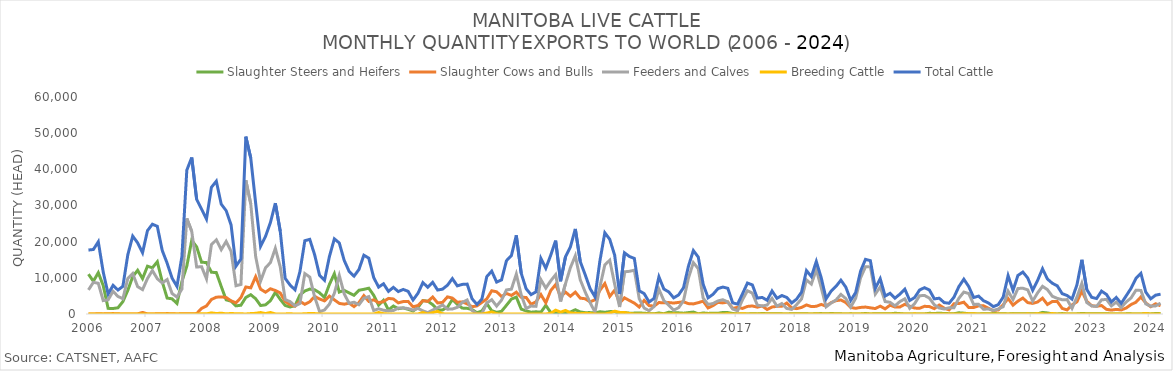
| Category | Slaughter Steers and Heifers | Slaughter Cows and Bulls | Feeders and Calves | Breeding Cattle | Total Cattle |
|---|---|---|---|---|---|
| 2006-01-01 | 11012 | 12 | 6661 | 0 | 17685 |
| 2006-02-01 | 9053 | 22 | 8762 | 0 | 17837 |
| 2006-03-01 | 11426 | 50 | 8493 | 0 | 19969 |
| 2006-04-01 | 7870 | 31 | 3706 | 0 | 11607 |
| 2006-05-01 | 1559 | 66 | 3914 | 0 | 5539 |
| 2006-06-01 | 1517 | 116 | 6281 | 0 | 7914 |
| 2006-07-01 | 1715 | 53 | 4860 | 0 | 6628 |
| 2006-08-01 | 3430 | 0 | 4226 | 0 | 7656 |
| 2006-09-01 | 6531 | 30 | 9804 | 0 | 16365 |
| 2006-10-01 | 10330 | 28 | 11172 | 0 | 21530 |
| 2006-11-01 | 12086 | 34 | 7560 | 0 | 19680 |
| 2006-12-01 | 9790 | 432 | 6739 | 0 | 16961 |
| 2007-01-01 | 13221 | 20 | 9806 | 0 | 23047 |
| 2007-02-01 | 12777 | 18 | 12028 | 0 | 24823 |
| 2007-03-01 | 14447 | 47 | 9751 | 0 | 24245 |
| 2007-04-01 | 8936 | 51 | 8583 | 0 | 17570 |
| 2007-05-01 | 4407 | 118 | 9529 | 0 | 14054 |
| 2007-06-01 | 4197 | 67 | 5667 | 0 | 9931 |
| 2007-07-01 | 2924 | 18 | 4689 | 0 | 7631 |
| 2007-08-01 | 8957 | 56 | 6884 | 0 | 15897 |
| 2007-09-01 | 13246 | 90 | 26436 | 0 | 39772 |
| 2007-10-01 | 20373 | 35 | 22855 | 0 | 43263 |
| 2007-11-01 | 18570 | 124 | 12991 | 0 | 31685 |
| 2007-12-01 | 14310 | 1544 | 13086 | 54 | 28994 |
| 2008-01-01 | 14234 | 2227 | 9728 | 36 | 26225 |
| 2008-02-01 | 11547 | 4011 | 19157 | 307 | 35022 |
| 2008-03-01 | 11453 | 4646 | 20512 | 132 | 36743 |
| 2008-04-01 | 7614 | 4728 | 17791 | 223 | 30356 |
| 2008-05-01 | 3915 | 4556 | 20068 | 41 | 28580 |
| 2008-06-01 | 3547 | 3638 | 17312 | 136 | 24633 |
| 2008-07-01 | 2246 | 3086 | 7814 | 72 | 13218 |
| 2008-08-01 | 2429 | 4526 | 8165 | 61 | 15181 |
| 2008-09-01 | 4574 | 7470 | 36975 | 11 | 49030 |
| 2008-10-01 | 5333 | 7226 | 30465 | 115 | 43139 |
| 2008-11-01 | 4226 | 10312 | 15890 | 191 | 30619 |
| 2008-12-01 | 2339 | 6867 | 9094 | 402 | 18702 |
| 2009-01-01 | 2532 | 6032 | 12756 | 126 | 21446 |
| 2009-02-01 | 3675 | 6977 | 14219 | 412 | 25283 |
| 2009-03-01 | 5982 | 6492 | 18150 | 25 | 30649 |
| 2009-04-01 | 4040 | 5811 | 13024 | 1 | 22876 |
| 2009-05-01 | 2357 | 3473 | 3988 | 28 | 9846 |
| 2009-06-01 | 1944 | 2571 | 3423 | 65 | 8003 |
| 2009-07-01 | 2289 | 2147 | 2252 | 3 | 6691 |
| 2009-08-01 | 5274 | 3492 | 2912 | 8 | 11686 |
| 2009-09-01 | 6360 | 2677 | 11172 | 56 | 20265 |
| 2009-10-01 | 6889 | 3390 | 10212 | 152 | 20643 |
| 2009-11-01 | 6687 | 4861 | 4687 | 114 | 16349 |
| 2009-12-01 | 5860 | 4154 | 638 | 3 | 10655 |
| 2010-01-01 | 4568 | 3629 | 1113 | 21 | 9331 |
| 2010-02-01 | 8199 | 4944 | 2727 | 33 | 15903 |
| 2010-03-01 | 11135 | 3911 | 5731 | 0 | 20777 |
| 2010-04-01 | 6059 | 2935 | 10659 | 4 | 19657 |
| 2010-05-01 | 6524 | 2712 | 5601 | 2 | 14839 |
| 2010-06-01 | 5849 | 3000 | 2945 | 2 | 11796 |
| 2010-07-01 | 5162 | 2052 | 3253 | 0 | 10467 |
| 2010-08-01 | 6571 | 3162 | 2563 | 3 | 12299 |
| 2010-09-01 | 6819 | 5087 | 4349 | 0 | 16255 |
| 2010-10-01 | 7134 | 3495 | 4815 | 3 | 15447 |
| 2010-11-01 | 5185 | 3931 | 977 | 2 | 10095 |
| 2010-12-01 | 2458 | 3131 | 1441 | 408 | 7438 |
| 2011-01-01 | 3788 | 3436 | 1039 | 91 | 8354 |
| 2011-02-01 | 1087 | 4309 | 863 | 0 | 6259 |
| 2011-03-01 | 2207 | 4162 | 963 | 31 | 7363 |
| 2011-04-01 | 1463 | 3082 | 1638 | 27 | 6210 |
| 2011-05-01 | 1675 | 3440 | 1671 | 2 | 6788 |
| 2011-06-01 | 1286 | 3487 | 1506 | 0 | 6279 |
| 2011-07-01 | 827 | 1977 | 1074 | 1 | 3879 |
| 2011-08-01 | 1805 | 2357 | 1549 | 7 | 5718 |
| 2011-09-01 | 3719 | 3683 | 878 | 394 | 8674 |
| 2011-10-01 | 3541 | 3488 | 372 | 0 | 7401 |
| 2011-11-01 | 2583 | 4689 | 1099 | 377 | 8748 |
| 2011-12-01 | 1126 | 3054 | 1718 | 731 | 6629 |
| 2012-01-01 | 1105 | 3199 | 2515 | 53 | 6872 |
| 2012-02-01 | 1887 | 4733 | 1337 | 0 | 7957 |
| 2012-03-01 | 3999 | 4399 | 1380 | 8 | 9786 |
| 2012-04-01 | 2667 | 3253 | 1832 | 24 | 7776 |
| 2012-05-01 | 1633 | 3356 | 3186 | 8 | 8183 |
| 2012-06-01 | 1575 | 2815 | 3874 | 0 | 8264 |
| 2012-07-01 | 1233 | 2010 | 963 | 3 | 4209 |
| 2012-08-01 | 332 | 2241 | 68 | 0 | 2641 |
| 2012-09-01 | 835 | 3213 | 70 | 0 | 4118 |
| 2012-10-01 | 2862 | 4173 | 3050 | 258 | 10343 |
| 2012-11-01 | 902 | 6423 | 3949 | 573 | 11847 |
| 2012-12-01 | 449 | 6138 | 2193 | 45 | 8825 |
| 2013-01-01 | 755 | 4837 | 3839 | 3 | 9434 |
| 2013-02-01 | 2408 | 5684 | 6652 | 0 | 14744 |
| 2013-03-01 | 4128 | 5141 | 6865 | 15 | 16149 |
| 2013-04-01 | 4674 | 6035 | 11030 | 10 | 21749 |
| 2013-05-01 | 1346 | 4640 | 5269 | 0 | 11255 |
| 2013-06-01 | 872 | 4575 | 1515 | 6 | 6968 |
| 2013-07-01 | 494 | 2669 | 2195 | 0 | 5358 |
| 2013-08-01 | 616 | 3390 | 2116 | 0 | 6122 |
| 2013-09-01 | 494 | 5371 | 9494 | 7 | 15366 |
| 2013-10-01 | 2406 | 3096 | 7168 | 0 | 12670 |
| 2013-11-01 | 394 | 6485 | 9180 | 193 | 16252 |
| 2013-12-01 | 235 | 8134 | 10874 | 1062 | 20305 |
| 2014-01-01 | 287 | 4810 | 3458 | 499 | 9054 |
| 2014-02-01 | 383 | 6054 | 8375 | 987 | 15799 |
| 2014-03-01 | 547 | 4908 | 12812 | 280 | 18547 |
| 2014-04-01 | 1177 | 6046 | 16098 | 199 | 23520 |
| 2014-05-01 | 561 | 4384 | 9468 | 94 | 14507 |
| 2014-06-01 | 375 | 4215 | 6097 | 188 | 10875 |
| 2014-07-01 | 383 | 3357 | 3157 | 132 | 7029 |
| 2014-08-01 | 290 | 3932 | 524 | 5 | 4751 |
| 2014-09-01 | 625 | 6545 | 7516 | 4 | 14690 |
| 2014-10-01 | 472 | 8424 | 13568 | 0 | 22464 |
| 2014-11-01 | 663 | 4859 | 14881 | 240 | 20643 |
| 2014-12-01 | 649 | 6580 | 8251 | 779 | 16259 |
| 2015-01-01 | 100 | 3038 | 1936 | 451 | 5525 |
| 2015-02-01 | 378 | 4466 | 11661 | 418 | 16923 |
| 2015-03-01 | 233 | 3728 | 11804 | 137 | 15902 |
| 2015-04-01 | 243 | 3007 | 12102 | 13 | 15365 |
| 2015-05-01 | 277 | 1929 | 4208 | 1 | 6415 |
| 2015-06-01 | 220 | 3754 | 1646 | 15 | 5635 |
| 2015-07-01 | 92 | 2322 | 897 | 2 | 3313 |
| 2015-08-01 | 42 | 2186 | 2071 | 3 | 4302 |
| 2015-09-01 | 288 | 3162 | 6832 | 0 | 10282 |
| 2015-10-01 | 63 | 3105 | 3726 | 6 | 6900 |
| 2015-11-01 | 495 | 3163 | 2445 | 0 | 6103 |
| 2015-12-01 | 332 | 3030 | 1064 | 41 | 4467 |
| 2016-01-01 | 321 | 3209 | 1739 | 4 | 5273 |
| 2016-02-01 | 226 | 3367 | 3682 | 6 | 7281 |
| 2016-03-01 | 379 | 2869 | 9941 | 7 | 13196 |
| 2016-04-01 | 532 | 2787 | 14207 | 13 | 17539 |
| 2016-05-01 | 58 | 3137 | 12538 | 0 | 15733 |
| 2016-06-01 | 283 | 3555 | 4382 | 9 | 8229 |
| 2016-07-01 | 163 | 1671 | 2646 | 0 | 4480 |
| 2016-08-01 | 209 | 2328 | 2902 | 3 | 5442 |
| 2016-09-01 | 189 | 3217 | 3604 | 5 | 7015 |
| 2016-10-01 | 430 | 3071 | 3947 | 0 | 7448 |
| 2016-11-01 | 394 | 3327 | 3326 | 61 | 7108 |
| 2016-12-01 | 138 | 1562 | 1385 | 0 | 3085 |
| 2017-01-01 | 20 | 1824 | 881 | 0 | 2725 |
| 2017-02-01 | 4 | 1546 | 3961 | 90 | 5601 |
| 2017-03-01 | 13 | 2095 | 6438 | 10 | 8556 |
| 2017-04-01 | 63 | 2222 | 5760 | 1 | 8046 |
| 2017-05-01 | 30 | 1888 | 2472 | 10 | 4400 |
| 2017-06-01 | 140 | 2214 | 2218 | 8 | 4580 |
| 2017-07-01 | 80 | 1243 | 2474 | 0 | 3797 |
| 2017-08-01 | 94 | 1938 | 4320 | 9 | 6361 |
| 2017-09-01 | 70 | 2104 | 2166 | 5 | 4345 |
| 2017-10-01 | 38 | 2161 | 2894 | 12 | 5105 |
| 2017-11-01 | 0 | 3036 | 1539 | 0 | 4575 |
| 2017-12-01 | 78 | 1701 | 1272 | 0 | 3051 |
| 2018-01-01 | 35 | 1481 | 2600 | 1 | 4117 |
| 2018-02-01 | 85 | 1816 | 4142 | 0 | 6043 |
| 2018-03-01 | 51 | 2513 | 9426 | 12 | 12002 |
| 2018-04-01 | 0 | 2057 | 8275 | 16 | 10348 |
| 2018-05-01 | 85 | 2123 | 12284 | 36 | 14528 |
| 2018-06-01 | 113 | 2646 | 7268 | 13 | 10040 |
| 2018-07-01 | 43 | 2160 | 1999 | 6 | 4208 |
| 2018-08-01 | 128 | 3142 | 3025 | 3 | 6298 |
| 2018-09-01 | 83 | 3685 | 3858 | 0 | 7626 |
| 2018-10-01 | 44 | 3877 | 5427 | 0 | 9348 |
| 2018-11-01 | 0 | 3164 | 4268 | 0 | 7432 |
| 2018-12-01 | 46 | 1807 | 1914 | 0 | 3767 |
| 2019-01-01 | 0 | 1581 | 4334 | 0 | 5915 |
| 2019-02-01 | 19 | 1818 | 9992 | 0 | 11829 |
| 2019-03-01 | 136 | 1919 | 13034 | 19 | 15108 |
| 2019-04-01 | 0 | 1701 | 13028 | 13 | 14742 |
| 2019-05-01 | 86 | 1502 | 5515 | 0 | 7103 |
| 2019-06-01 | 81 | 2170 | 7494 | 9 | 9754 |
| 2019-07-01 | 86 | 1421 | 3446 | 9 | 4962 |
| 2019-08-01 | 48 | 2439 | 3230 | 0 | 5717 |
| 2019-09-01 | 203 | 1928 | 2255 | 1 | 4387 |
| 2019-10-01 | 108 | 1943 | 3436 | 0 | 5487 |
| 2019-11-01 | 0 | 2683 | 4193 | 0 | 6876 |
| 2019-12-01 | 0 | 2152 | 1582 | 0 | 3734 |
| 2020-01-01 | 0 | 1641 | 2873 | 48 | 4562 |
| 2020-02-01 | 3 | 1582 | 5047 | 0 | 6632 |
| 2020-03-01 | 8 | 2125 | 5129 | 18 | 7280 |
| 2020-04-01 | 190 | 2050 | 4390 | 4 | 6634 |
| 2020-05-01 | 138 | 1493 | 2554 | 0 | 4185 |
| 2020-06-01 | 225 | 2482 | 1658 | 0 | 4365 |
| 2020-07-01 | 137 | 1623 | 1387 | 10 | 3157 |
| 2020-08-01 | 94 | 1145 | 1727 | 0 | 2966 |
| 2020-09-01 | 76 | 2837 | 1744 | 0 | 4657 |
| 2020-10-01 | 333 | 2894 | 4368 | 0 | 7595 |
| 2020-11-01 | 233 | 3269 | 6061 | 52 | 9615 |
| 2020-12-01 | 75 | 1807 | 5657 | 38 | 7577 |
| 2021-01-01 | 45 | 1800 | 2644 | 77 | 4566 |
| 2021-02-01 | 0 | 2250 | 2697 | 0 | 4947 |
| 2021-03-01 | 93 | 2256 | 1301 | 35 | 3685 |
| 2021-04-01 | 47 | 1586 | 1404 | 14 | 3051 |
| 2021-05-01 | 130 | 921 | 976 | 5 | 2032 |
| 2021-06-01 | 87 | 1129 | 1363 | 4 | 2583 |
| 2021-07-01 | 92 | 2557 | 2019 | 0 | 4668 |
| 2021-08-01 | 6 | 4272 | 6307 | 8 | 10593 |
| 2021-09-01 | 108 | 2446 | 4000 | 0 | 6554 |
| 2021-10-01 | 38 | 3562 | 7054 | 0 | 10654 |
| 2021-11-01 | 57 | 4402 | 7129 | 11 | 11599 |
| 2021-12-01 | 93 | 3149 | 6670 | 41 | 9953 |
| 2022-01-01 | 47 | 2932 | 3571 | 2 | 6552 |
| 2022-02-01 | 30 | 3319 | 5847 | 79 | 9275 |
| 2022-03-01 | 445 | 4377 | 7646 | 42 | 12510 |
| 2022-04-01 | 286 | 2633 | 6743 | 8 | 9670 |
| 2022-05-01 | 27 | 3450 | 4896 | 127 | 8500 |
| 2022-06-01 | 10 | 3444 | 4325 | 0 | 7779 |
| 2022-07-01 | 124 | 1546 | 3946 | 13 | 5629 |
| 2022-08-01 | 0 | 1129 | 3980 | 4 | 5113 |
| 2022-09-01 | 33 | 2513 | 1567 | 0 | 4113 |
| 2022-10-01 | 34 | 3363 | 4662 | 0 | 8059 |
| 2022-11-01 | 142 | 6338 | 8488 | 8 | 14976 |
| 2022-12-01 | 85 | 3515 | 3166 | 18 | 6784 |
| 2023-01-01 | 101 | 2290 | 2219 | 0 | 4610 |
| 2023-02-01 | 44 | 2139 | 2089 | 0 | 4272 |
| 2023-03-01 | 44 | 2344 | 3908 | 33 | 6329 |
| 2023-04-01 | 75 | 1288 | 4040 | 15 | 5418 |
| 2023-05-01 | 2 | 1079 | 2251 | 5 | 3337 |
| 2023-06-01 | 2 | 1277 | 3288 | 2 | 4569 |
| 2023-07-01 | 1 | 1131 | 1797 | 7 | 2936 |
| 2023-08-01 | 34 | 1641 | 3309 | 5 | 4989 |
| 2023-09-01 | 36 | 2606 | 4437 | 15 | 7094 |
| 2023-10-01 | 16 | 3263 | 6568 | 1 | 9848 |
| 2023-11-01 | 20 | 4704 | 6522 | 2 | 11248 |
| 2023-12-01 | 60 | 3060 | 2793 | 128 | 6041 |
| 2024-01-01 | 21 | 2012 | 2164 | 1 | 4198 |
| 2024-02-01 | 136 | 2827 | 2238 | 9 | 5210 |
| 2024-03-01 | 153 | 2287 | 2998 | 42 | 5480 |